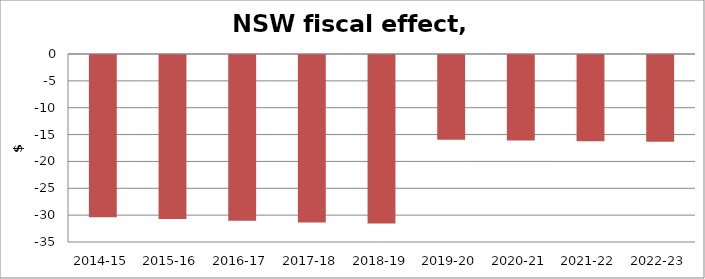
| Category | Series 0 |
|---|---|
| 2014-15 | -30.207 |
| 2015-16 | -30.51 |
| 2016-17 | -30.85 |
| 2017-18 | -31.176 |
| 2018-19 | -31.376 |
| 2019-20 | -15.791 |
| 2020-21 | -15.915 |
| 2021-22 | -16.039 |
| 2022-23 | -16.167 |